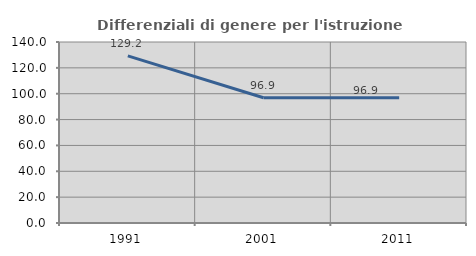
| Category | Differenziali di genere per l'istruzione superiore |
|---|---|
| 1991.0 | 129.231 |
| 2001.0 | 96.867 |
| 2011.0 | 96.906 |